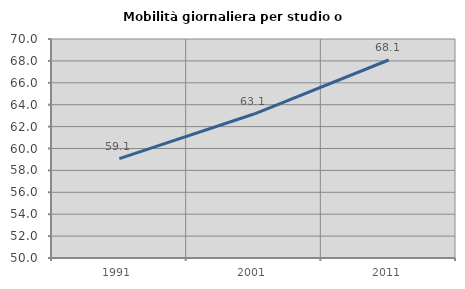
| Category | Mobilità giornaliera per studio o lavoro |
|---|---|
| 1991.0 | 59.078 |
| 2001.0 | 63.148 |
| 2011.0 | 68.082 |